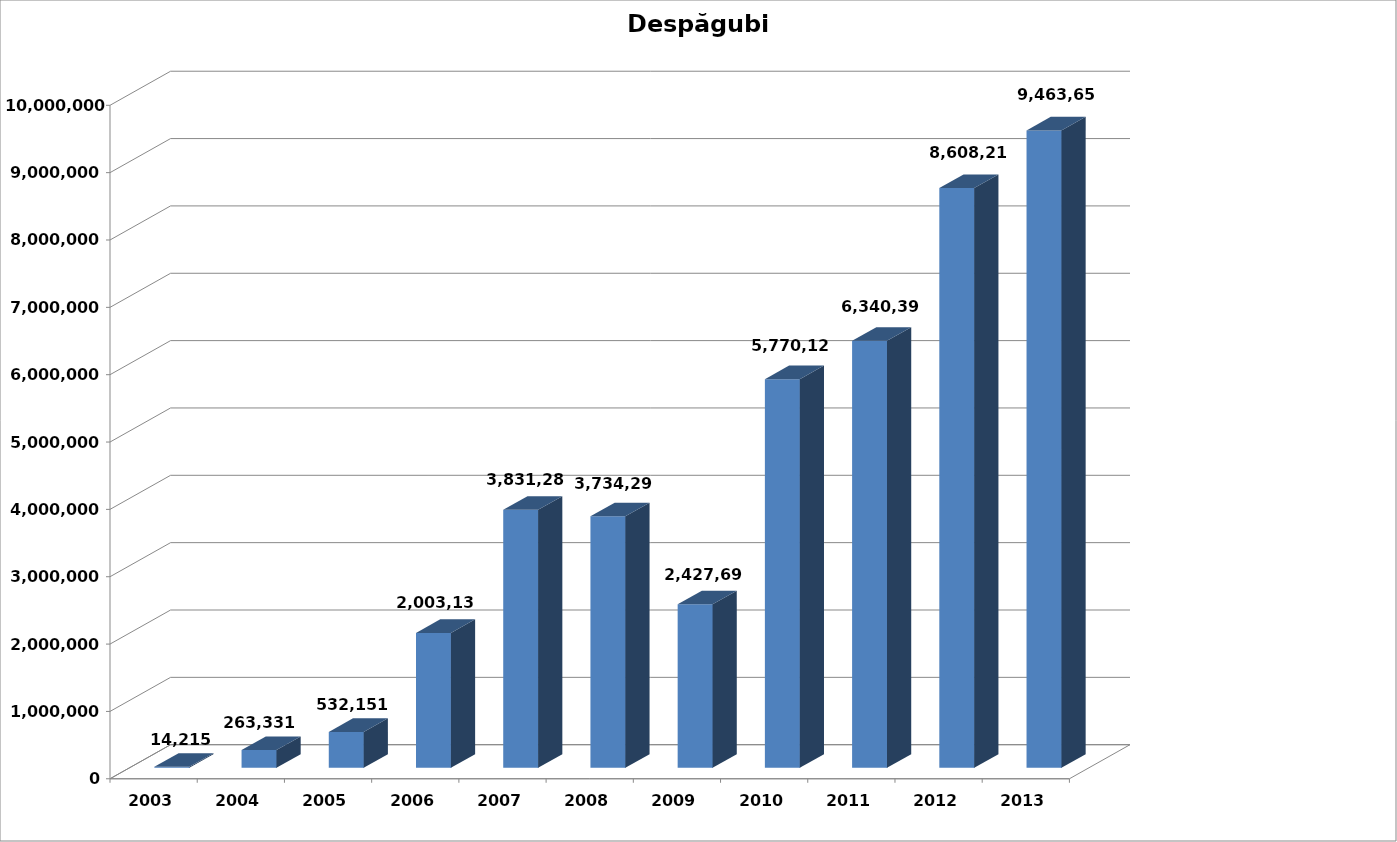
| Category | Plăți pe despăgubiri |
|---|---|
| 2003.0 | 14215 |
| 2004.0 | 263331 |
| 2005.0 | 532151 |
| 2006.0 | 2003133 |
| 2007.0 | 3831280 |
| 2008.0 | 3734298 |
| 2009.0 | 2427693 |
| 2010.0 | 5770125 |
| 2011.0 | 6340394 |
| 2012.0 | 8608214 |
| 2013.0 | 9463650 |